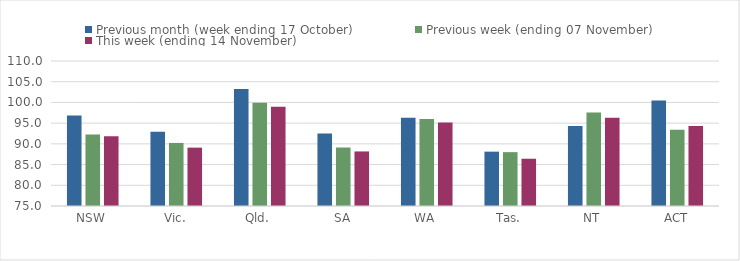
| Category | Previous month (week ending 17 October) | Previous week (ending 07 November) | This week (ending 14 November) |
|---|---|---|---|
| NSW | 96.87 | 92.25 | 91.85 |
| Vic. | 92.95 | 90.22 | 89.09 |
| Qld. | 103.25 | 99.9 | 98.98 |
| SA | 92.49 | 89.12 | 88.17 |
| WA | 96.28 | 95.97 | 95.17 |
| Tas. | 88.12 | 88 | 86.41 |
| NT | 94.29 | 97.58 | 96.28 |
| ACT | 100.47 | 93.4 | 94.3 |